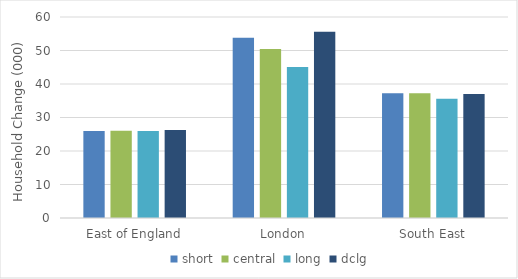
| Category | short | central | long | dclg |
|---|---|---|---|---|
| East of England | 25.986 | 26.056 | 25.989 | 26.238 |
| London | 53.809 | 50.469 | 45.077 | 55.592 |
| South East | 37.252 | 37.236 | 35.601 | 37.008 |